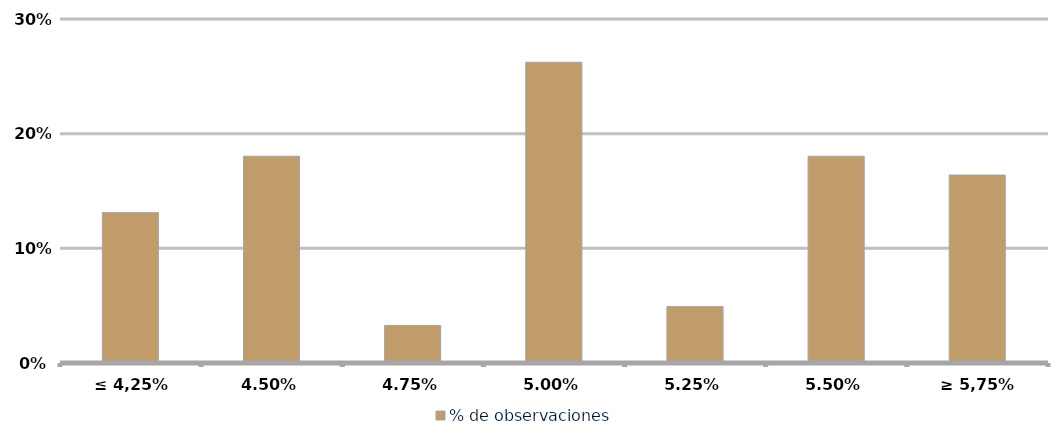
| Category | % de observaciones  |
|---|---|
| ≤ 4,25% | 0.131 |
| 4,50% | 0.18 |
| 4,75% | 0.033 |
| 5,00% | 0.262 |
| 5,25% | 0.049 |
| 5,50% | 0.18 |
| ≥ 5,75% | 0.164 |